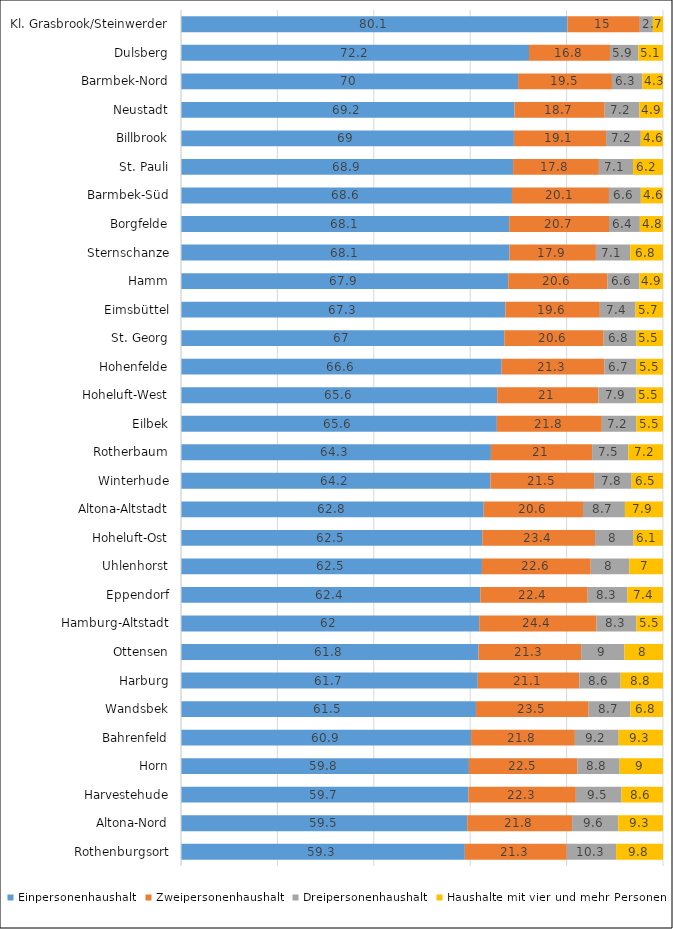
| Category | Einpersonenhaushalt | Zweipersonenhaushalt | Dreipersonenhaushalt | Haushalte mit vier und mehr Personen  |
|---|---|---|---|---|
| Kl. Grasbrook/Steinwerder | 80.1 | 15 | 2.7 | 2.1 |
| Dulsberg | 72.2 | 16.8 | 5.9 | 5.1 |
| Barmbek-Nord | 70 | 19.5 | 6.3 | 4.3 |
| Neustadt | 69.2 | 18.7 | 7.2 | 4.9 |
| Billbrook | 69 | 19.1 | 7.2 | 4.6 |
| St. Pauli | 68.9 | 17.8 | 7.1 | 6.2 |
| Barmbek-Süd | 68.6 | 20.1 | 6.6 | 4.6 |
| Borgfelde | 68.1 | 20.7 | 6.4 | 4.8 |
| Sternschanze | 68.1 | 17.9 | 7.1 | 6.8 |
| Hamm | 67.9 | 20.6 | 6.6 | 4.9 |
| Eimsbüttel | 67.3 | 19.6 | 7.4 | 5.7 |
| St. Georg | 67 | 20.6 | 6.8 | 5.5 |
| Hohenfelde | 66.6 | 21.3 | 6.7 | 5.5 |
| Hoheluft-West | 65.6 | 21 | 7.9 | 5.5 |
| Eilbek | 65.6 | 21.8 | 7.2 | 5.5 |
| Rotherbaum | 64.3 | 21 | 7.5 | 7.2 |
| Winterhude | 64.2 | 21.5 | 7.8 | 6.5 |
| Altona-Altstadt | 62.8 | 20.6 | 8.7 | 7.9 |
| Hoheluft-Ost | 62.5 | 23.4 | 8 | 6.1 |
| Uhlenhorst | 62.5 | 22.6 | 8 | 7 |
| Eppendorf | 62.4 | 22.4 | 8.3 | 7.4 |
| Hamburg-Altstadt | 62 | 24.4 | 8.3 | 5.5 |
| Ottensen | 61.8 | 21.3 | 9 | 8 |
| Harburg | 61.7 | 21.1 | 8.6 | 8.8 |
| Wandsbek | 61.5 | 23.5 | 8.7 | 6.8 |
| Bahrenfeld | 60.9 | 21.8 | 9.2 | 9.3 |
| Horn | 59.8 | 22.5 | 8.8 | 9 |
| Harvestehude | 59.7 | 22.3 | 9.5 | 8.6 |
| Altona-Nord | 59.5 | 21.8 | 9.6 | 9.3 |
| Rothenburgsort | 59.3 | 21.3 | 10.3 | 9.8 |